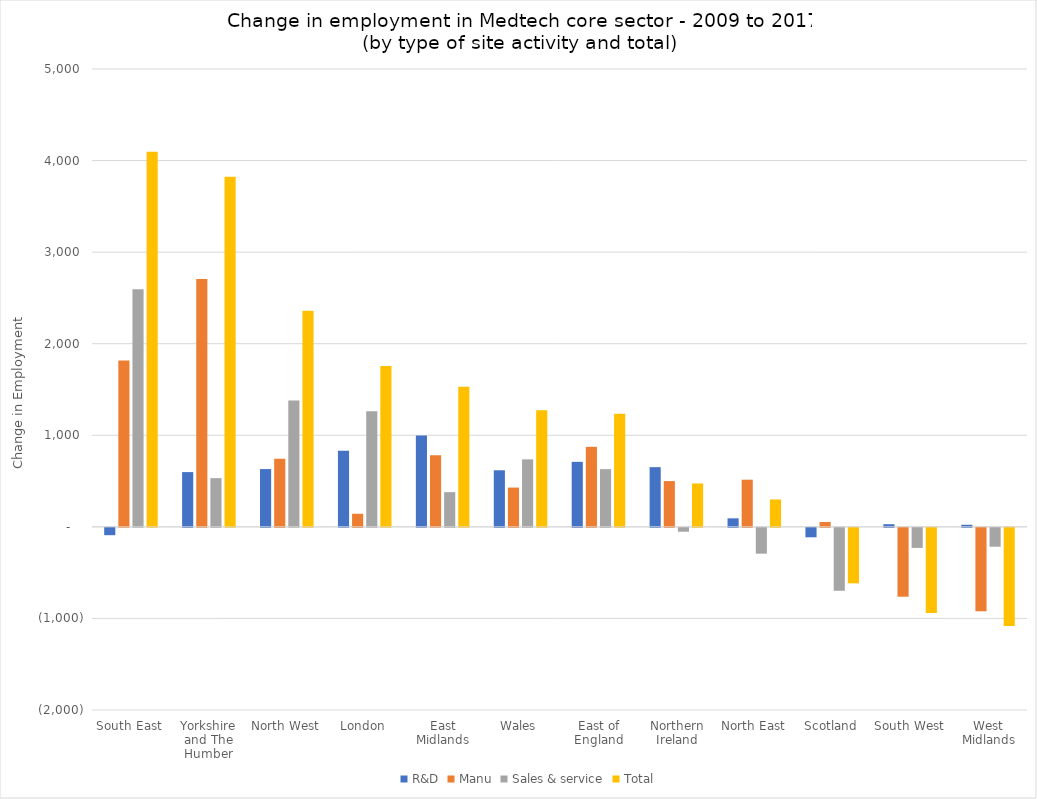
| Category | R&D | Manu | Sales & service | Total |
|---|---|---|---|---|
| South East | -80 | 1817 | 2595 | 4095 |
| Yorkshire and The Humber | 598 | 2708 | 532 | 3823 |
| North West | 631 | 744 | 1381 | 2359 |
| London | 830 | 143 | 1263 | 1757 |
| East Midlands | 998 | 783 | 379 | 1529 |
| Wales | 618 | 429 | 737 | 1274 |
| East of England | 710 | 874 | 630 | 1235 |
| Northern Ireland | 652 | 500 | -42 | 474 |
| North East | 93 | 515 | -282 | 299 |
| Scotland | -103 | 53 | -687 | -606 |
| South West | 29 | -752 | -219 | -930 |
| West Midlands | 23 | -910 | -206 | -1071 |